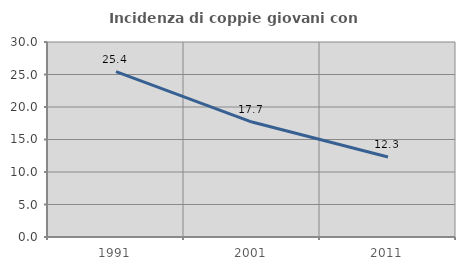
| Category | Incidenza di coppie giovani con figli |
|---|---|
| 1991.0 | 25.436 |
| 2001.0 | 17.682 |
| 2011.0 | 12.299 |